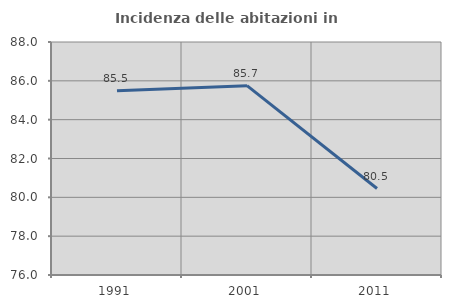
| Category | Incidenza delle abitazioni in proprietà  |
|---|---|
| 1991.0 | 85.492 |
| 2001.0 | 85.75 |
| 2011.0 | 80.454 |